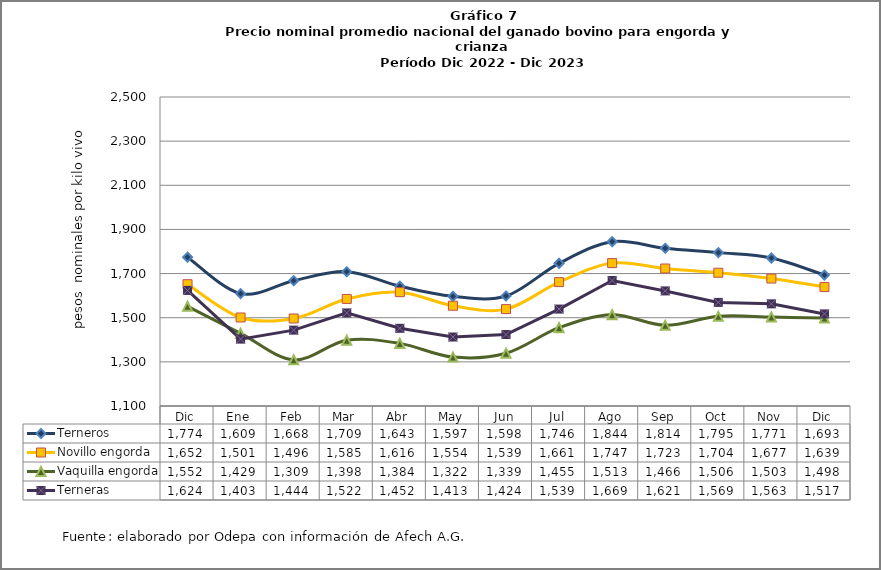
| Category | Terneros | Novillo engorda | Vaquilla engorda | Terneras |
|---|---|---|---|---|
| Dic | 1774.302 | 1651.844 | 1551.69 | 1623.74 |
| Ene | 1609.19 | 1501.066 | 1429.039 | 1403.06 |
| Feb | 1667.798 | 1496.45 | 1309.165 | 1443.727 |
| Mar | 1708.551 | 1585.13 | 1397.969 | 1521.727 |
| Abr | 1642.675 | 1615.843 | 1383.721 | 1451.997 |
| May | 1596.896 | 1554.322 | 1321.507 | 1412.528 |
| Jun | 1598.39 | 1538.929 | 1338.799 | 1423.816 |
| Jul | 1746.407 | 1661.38 | 1454.767 | 1539.126 |
| Ago | 1844.402 | 1747.338 | 1513.416 | 1668.569 |
| Sep | 1814.46 | 1722.957 | 1465.556 | 1621.424 |
| Oct | 1794.889 | 1703.775 | 1506.438 | 1569.408 |
| Nov | 1770.639 | 1677.463 | 1503.199 | 1562.808 |
| Dic | 1693.068 | 1638.932 | 1498.387 | 1517.249 |